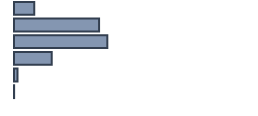
| Category | Percentatge |
|---|---|
| 0 | 8.457 |
| 1 | 35.447 |
| 2 | 38.884 |
| 3 | 15.717 |
| 4 | 1.448 |
| 5 | 0.048 |